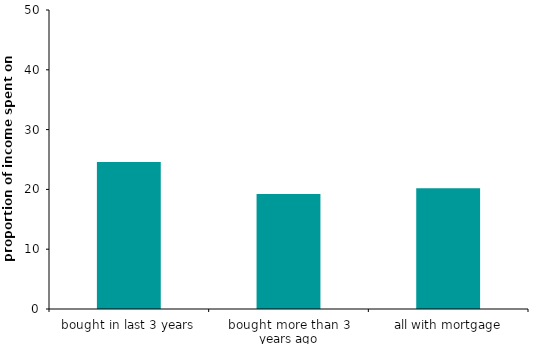
| Category | #REF! |
|---|---|
| bought in last 3 years | 24.569 |
| bought more than 3 years ago | 19.251 |
| all with mortgage | 20.195 |